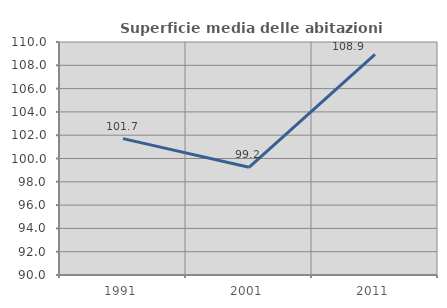
| Category | Superficie media delle abitazioni occupate |
|---|---|
| 1991.0 | 101.705 |
| 2001.0 | 99.245 |
| 2011.0 | 108.933 |